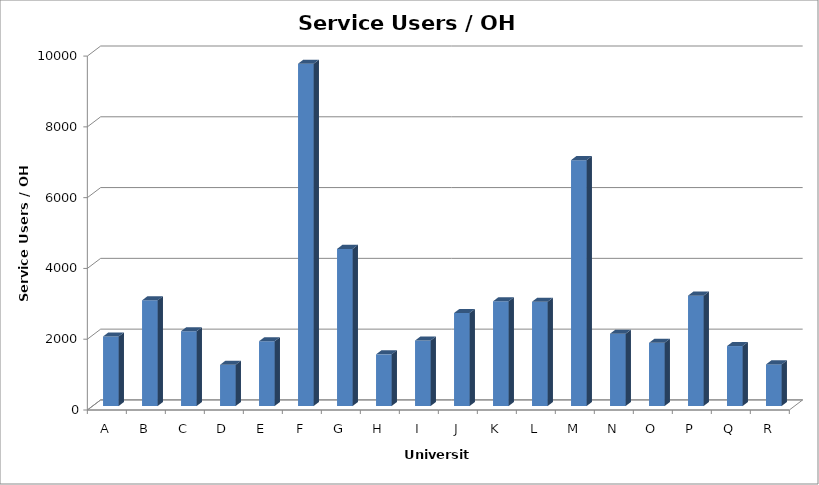
| Category | Service Users / OH FTE |
|---|---|
| A | 1965.217 |
| B | 2986.047 |
| C | 2115 |
| D | 1165.269 |
| E | 1830.357 |
| F | 9672.558 |
| G | 4439.31 |
| H | 1459.459 |
| I | 1850 |
| J | 2627.778 |
| K | 2959.39 |
| L | 2947.5 |
| M | 6947.368 |
| N | 2044 |
| O | 1786 |
| P | 3119.048 |
| Q | 1694.444 |
| R | 1176 |